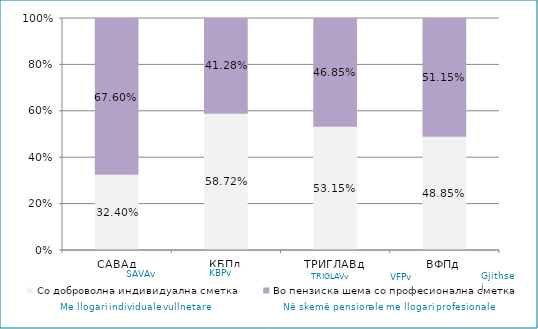
| Category | Со доброволна индивидуална сметка  | Во пензиска шема со професионална сметка |
|---|---|---|
| САВАд | 0.324 | 0.676 |
| КБПд | 0.587 | 0.413 |
| ТРИГЛАВд | 0.531 | 0.469 |
| ВФПд | 0.489 | 0.511 |